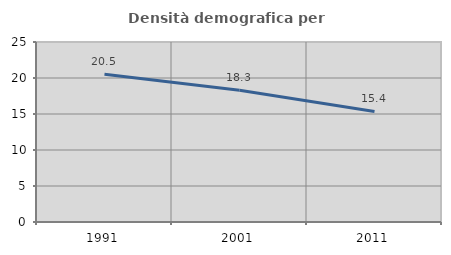
| Category | Densità demografica |
|---|---|
| 1991.0 | 20.523 |
| 2001.0 | 18.289 |
| 2011.0 | 15.357 |